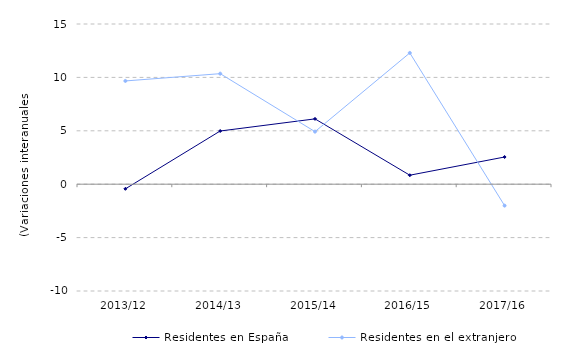
| Category | Residentes en España | Residentes en el extranjero |
|---|---|---|
| 2013/12 | -0.434 | 9.669 |
| 2014/13 | 4.981 | 10.349 |
| 2015/14 | 6.116 | 4.921 |
| 2016/15 | 0.842 | 12.291 |
| 2017/16 | 2.546 | -2.007 |